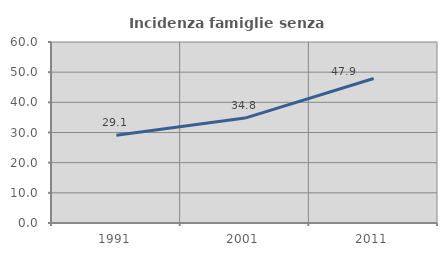
| Category | Incidenza famiglie senza nuclei |
|---|---|
| 1991.0 | 29.114 |
| 2001.0 | 34.783 |
| 2011.0 | 47.895 |